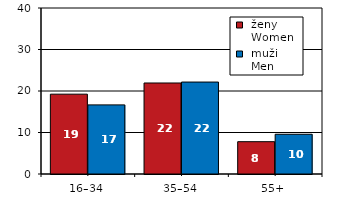
| Category |  ženy 
 Women |  muži 
 Men |
|---|---|---|
| 16–34 | 19.239 | 16.655 |
| 35–54 | 21.928 | 22.157 |
| 55+  | 7.789 | 9.576 |